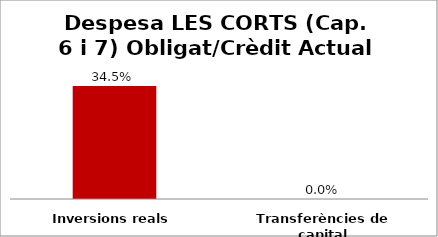
| Category | Series 0 |
|---|---|
| Inversions reals | 0.345 |
| Transferències de capital | 0 |